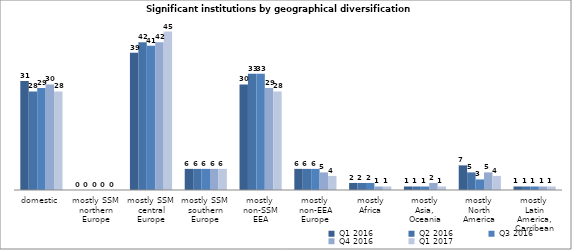
| Category | Q1 2016 | Q2 2016 | Q3 2016 | Q4 2016 | Q1 2017 |
|---|---|---|---|---|---|
| domestic | 31 | 28 | 29 | 30 | 28 |
| mostly SSM 
northern Europe | 0 | 0 | 0 | 0 | 0 |
| mostly SSM 
central Europe | 39 | 42 | 41 | 42 | 45 |
| mostly SSM 
southern Europe | 6 | 6 | 6 | 6 | 6 |
| mostly 
non-SSM EEA | 30 | 33 | 33 | 29 | 28 |
| mostly 
non-EEA Europe | 6 | 6 | 6 | 5 | 4 |
| mostly
Africa | 2 | 2 | 2 | 1 | 1 |
| mostly 
Asia, 
Oceania | 1 | 1 | 1 | 2 | 1 |
| mostly 
North America | 7 | 5 | 3 | 5 | 4 |
| mostly 
Latin America,
Carribean | 1 | 1 | 1 | 1 | 1 |